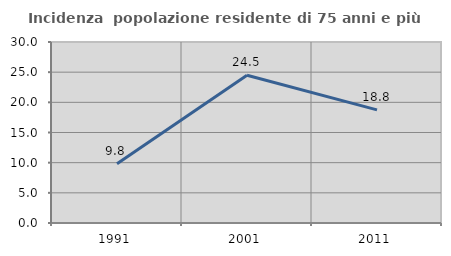
| Category | Incidenza  popolazione residente di 75 anni e più |
|---|---|
| 1991.0 | 9.804 |
| 2001.0 | 24.49 |
| 2011.0 | 18.75 |